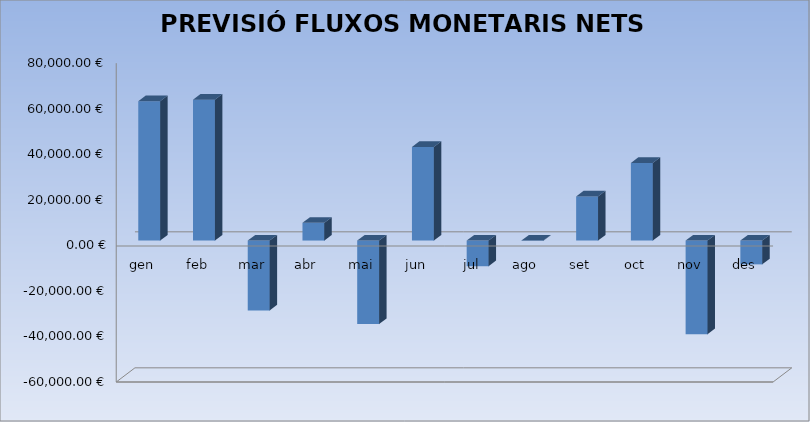
| Category | 61.151,71 € |
|---|---|
| gen | 61151.71 |
| feb | 61872.19 |
| mar | -30688.04 |
| abr | 7779.75 |
| mai | -36669.38 |
| jun | 41109.99 |
| jul | -11279.46 |
| ago | -139.41 |
| set | 19385.7 |
| oct | 34069.68 |
| nov | -41162.62 |
| des | -10461.27 |